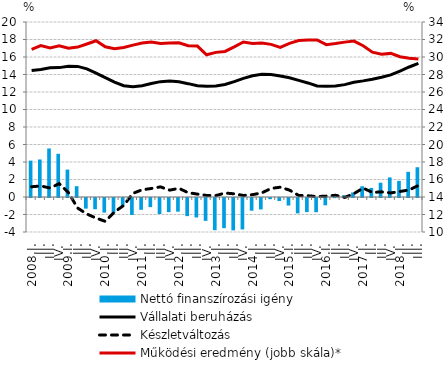
| Category | Nettó finanszírozási igény |
|---|---|
| 2008.I. | 4.156 |
| II. | 4.29 |
| III. | 5.545 |
| IV. | 4.935 |
| 2009.I. | 3.13 |
| II. | 1.236 |
| III. | -1.214 |
| IV. | -1.287 |
| 2010.I. | -1.668 |
| II. | -1.744 |
| III. | -0.885 |
| IV. | -1.945 |
| 2011.I. | -1.349 |
| II. | -1.042 |
| III. | -1.828 |
| IV. | -1.616 |
| 2012.I. | -1.564 |
| II. | -2.071 |
| III. | -2.225 |
| IV. | -2.613 |
| 2013.I. | -3.675 |
| II. | -3.449 |
| III. | -3.702 |
| IV. | -3.595 |
| 2014.I. | -1.451 |
| II. | -1.309 |
| III. | -0.138 |
| IV. | -0.343 |
| 2015.I. | -0.863 |
| II. | -1.757 |
| III. | -1.615 |
| IV. | -1.629 |
| 2016.I. | -0.834 |
| II. | -0.017 |
| III. | 0.192 |
| IV. | 0.513 |
| 2017.I. | 1.225 |
| II. | 1.041 |
| III. | 1.633 |
| IV. | 2.238 |
| 2018.I. | 1.841 |
| II. | 2.878 |
| III. | 3.401 |